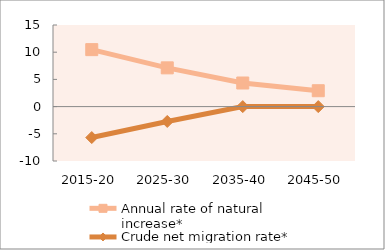
| Category | Annual rate of natural increase* | Crude net migration rate* |
|---|---|---|
| 2015-20 | 10.472 | -5.691 |
| 2025-30 | 7.124 | -2.733 |
| 2035-40 | 4.338 | 0 |
| 2045-50 | 2.919 | 0 |